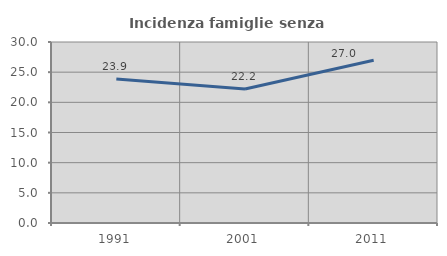
| Category | Incidenza famiglie senza nuclei |
|---|---|
| 1991.0 | 23.878 |
| 2001.0 | 22.204 |
| 2011.0 | 26.977 |